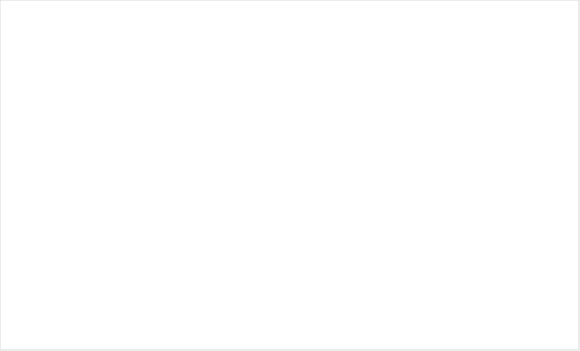
| Category | Итог |
|---|---|
| 8 | 2 |
| 9 | 6 |
| 10 | 8 |